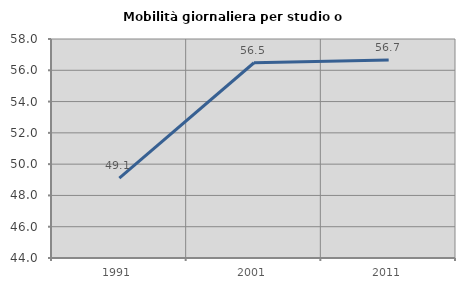
| Category | Mobilità giornaliera per studio o lavoro |
|---|---|
| 1991.0 | 49.102 |
| 2001.0 | 56.481 |
| 2011.0 | 56.653 |